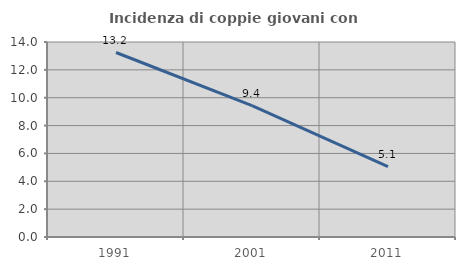
| Category | Incidenza di coppie giovani con figli |
|---|---|
| 1991.0 | 13.245 |
| 2001.0 | 9.434 |
| 2011.0 | 5.051 |